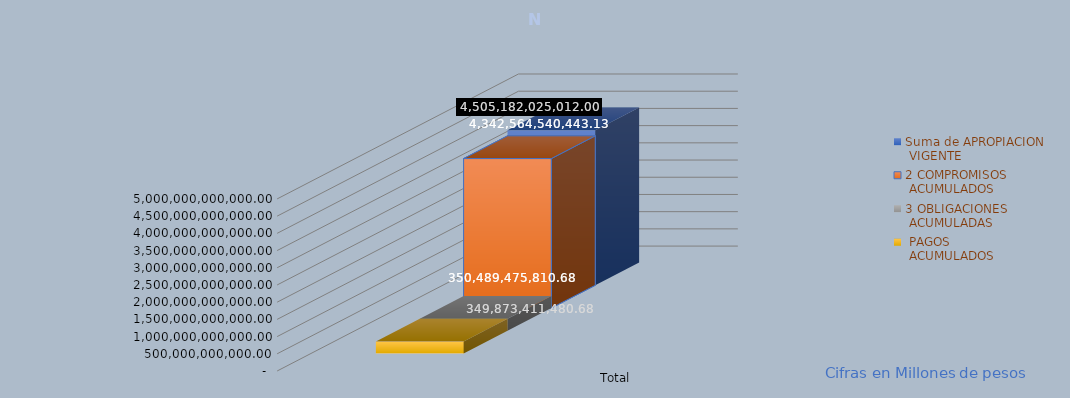
| Category | Suma de APROPIACION
 VIGENTE | 2 COMPROMISOS
 ACUMULADOS | 3 OBLIGACIONES
 ACUMULADAS |  PAGOS
 ACUMULADOS |
|---|---|---|---|---|
| Total | 4505182025012 | 4342564540443.13 | 350489475810.68 | 349873411480.68 |